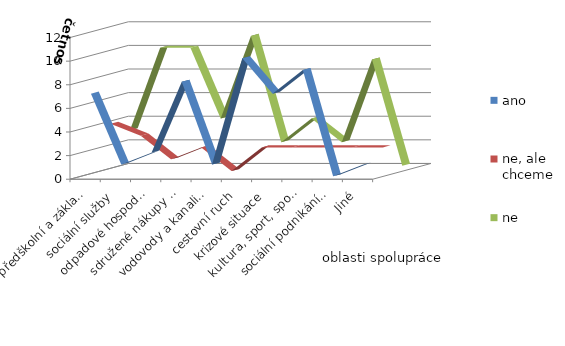
| Category | ano | ne, ale chceme | ne |
|---|---|---|---|
| předškolní a základní vzdělávání | 7 | 4 | 3 |
| sociální služby | 1 | 3 | 10 |
| odpadové hospodářství | 2 | 1 | 10 |
| sdružené nákupy (úspory) | 8 | 2 | 4 |
| vodovody a kanalizace | 1 | 0 | 11 |
| cestovní ruch | 10 | 2 | 2 |
| krizové situace | 7 | 2 | 4 |
| kultura, sport, spolky | 9 | 2 | 2 |
| sociální podnikání, zaměstnanost | 0 | 2 | 9 |
| Jiné | 1 | 2 | 0 |